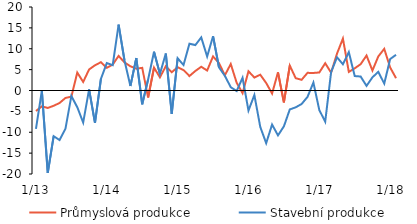
| Category | Průmyslová produkce | Stavební produkce |
|---|---|---|
|  1/13 | -4.911 | -9.172 |
| 2 | -3.806 | -0.057 |
| 3 | -4.182 | -19.723 |
| 4 | -3.661 | -10.949 |
| 5 | -2.99 | -11.851 |
| 6 | -1.783 | -9.139 |
| 7 | -1.479 | -1.299 |
| 8 | 4.297 | -3.998 |
| 9 | 2.048 | -7.696 |
| 10 | 5.036 | 0.265 |
| 11 | 6.045 | -7.764 |
| 12 | 6.773 | 2.754 |
|  1/14 | 5.435 | 6.56 |
| 2 | 6.203 | 6.057 |
| 3 | 8.282 | 15.795 |
| 4 | 6.732 | 7.184 |
| 5 | 5.797 | 1.078 |
| 6 | 5.226 | 7.779 |
| 7 | 5.423 | -3.3 |
| 8 | -1.669 | 2.655 |
| 9 | 5.481 | 9.297 |
| 10 | 3.151 | 3.978 |
| 11 | 5.822 | 8.861 |
| 12 | 4.37 | -5.586 |
|  1/15 | 5.578 | 7.726 |
| 2 | 4.89 | 6.1 |
| 3 | 3.468 | 11.217 |
| 4 | 4.673 | 10.879 |
| 5 | 5.689 | 12.707 |
| 6 | 4.783 | 8.158 |
| 7 | 8.163 | 13.013 |
| 8 | 6.583 | 5.557 |
| 9 | 3.645 | 3.514 |
| 10 | 6.344 | 0.785 |
| 11 | 1.856 | -0.13 |
| 12 | -0.637 | 3.053 |
|  1/16 | 4.608 | -4.805 |
| 2 | 3.106 | -1.077 |
| 3 | 3.783 | -8.731 |
| 4 | 1.799 | -12.616 |
| 5 | -0.727 | -8.155 |
| 6 | 4.352 | -10.748 |
| 7 | -2.847 | -8.587 |
| 8 | 5.968 | -4.537 |
| 9 | 2.948 | -4.028 |
| 10 | 2.563 | -3.238 |
| 11 | 4.227 | -1.539 |
| 12 | 4.203 | 1.9 |
|  1/17 | 4.319 | -4.69 |
| 2 | 6.528 | -7.46 |
| 3 | 4.27 | 4.423 |
| 4 | 8.839 | 7.96 |
| 5 | 12.438 | 6.278 |
| 6 | 4.454 | 9.181 |
| 7 | 5.31 | 3.46 |
| 8 | 6.302 | 3.348 |
| 9 | 8.374 | 1.108 |
| 10 | 4.785 | 3.157 |
| 11 | 8.174 | 4.473 |
| 12 | 9.973 | 1.653 |
|  1/18 | 5.52 | 7.524 |
| 2 | 2.95 | 8.558 |